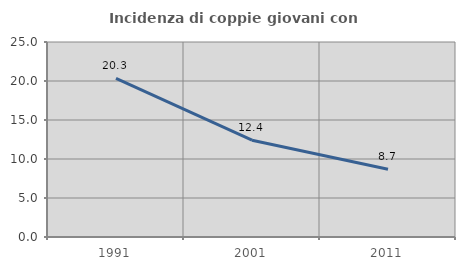
| Category | Incidenza di coppie giovani con figli |
|---|---|
| 1991.0 | 20.346 |
| 2001.0 | 12.405 |
| 2011.0 | 8.678 |